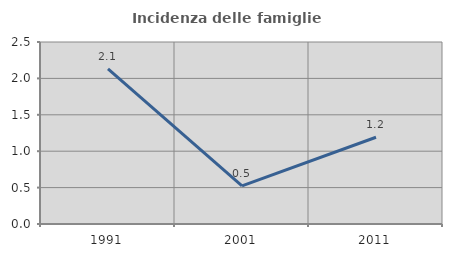
| Category | Incidenza delle famiglie numerose |
|---|---|
| 1991.0 | 2.131 |
| 2001.0 | 0.523 |
| 2011.0 | 1.191 |